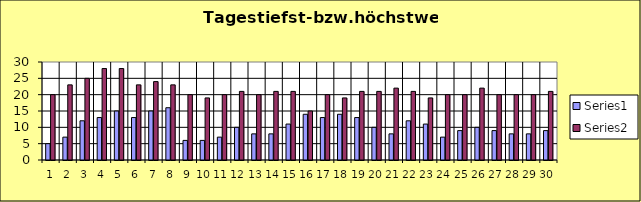
| Category | Series 0 | Series 1 |
|---|---|---|
| 0 | 5 | 20 |
| 1 | 7 | 23 |
| 2 | 12 | 25 |
| 3 | 13 | 28 |
| 4 | 15 | 28 |
| 5 | 13 | 23 |
| 6 | 15 | 24 |
| 7 | 16 | 23 |
| 8 | 6 | 20 |
| 9 | 6 | 19 |
| 10 | 7 | 20 |
| 11 | 10 | 21 |
| 12 | 8 | 20 |
| 13 | 8 | 21 |
| 14 | 11 | 21 |
| 15 | 14 | 15 |
| 16 | 13 | 20 |
| 17 | 14 | 19 |
| 18 | 13 | 21 |
| 19 | 10 | 21 |
| 20 | 8 | 22 |
| 21 | 12 | 21 |
| 22 | 11 | 19 |
| 23 | 7 | 20 |
| 24 | 9 | 20 |
| 25 | 10 | 22 |
| 26 | 9 | 20 |
| 27 | 8 | 20 |
| 28 | 8 | 20 |
| 29 | 9 | 21 |